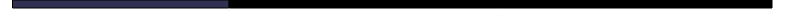
| Category | Series 0 | Series 1 |
|---|---|---|
| 0 | 28.522 | 71.478 |